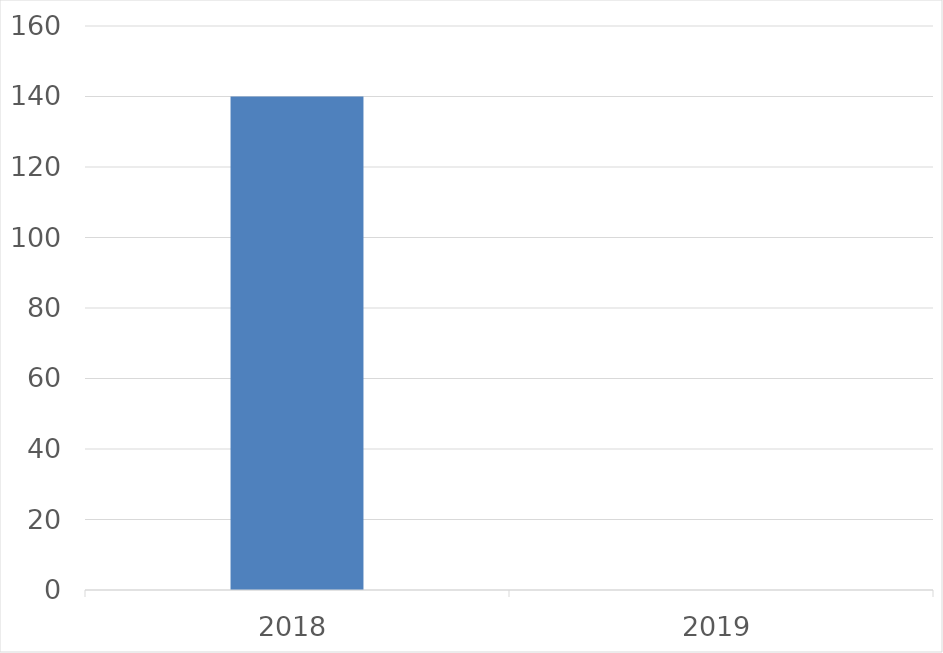
| Category | Series 0 |
|---|---|
| 2018 | 140 |
| 2019 | 0 |